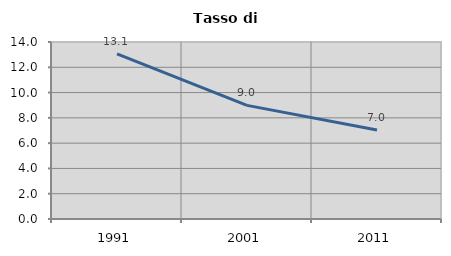
| Category | Tasso di disoccupazione   |
|---|---|
| 1991.0 | 13.063 |
| 2001.0 | 8.989 |
| 2011.0 | 7.042 |